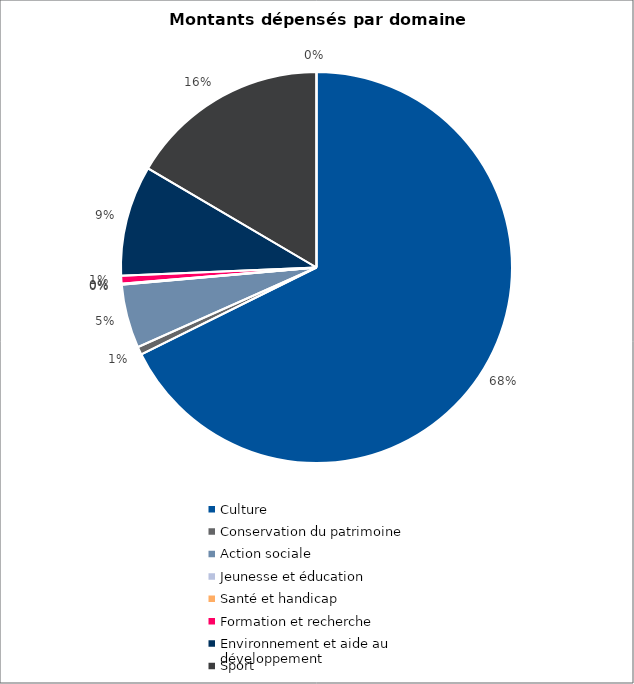
| Category | Series 0 |
|---|---|
| Culture | 1027019 |
| Conservation du patrimoine | 10000 |
| Action sociale | 80000 |
| Jeunesse et éducation | 200 |
| Santé et handicap | 1000 |
| Formation et recherche | 10000 |
| Environnement et aide au
développement | 138500 |
| Sport | 251000 |
| Autres projets d’utilité publique | 0 |